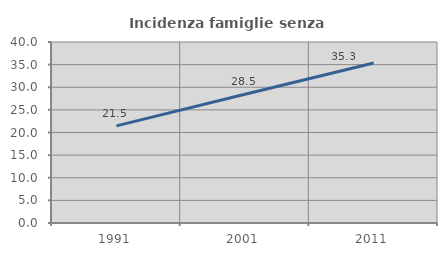
| Category | Incidenza famiglie senza nuclei |
|---|---|
| 1991.0 | 21.458 |
| 2001.0 | 28.464 |
| 2011.0 | 35.35 |